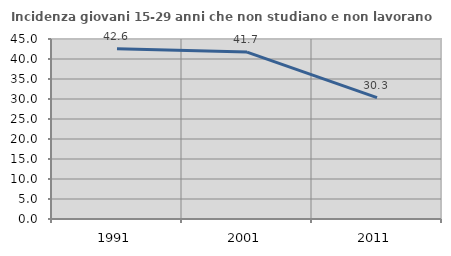
| Category | Incidenza giovani 15-29 anni che non studiano e non lavorano  |
|---|---|
| 1991.0 | 42.593 |
| 2001.0 | 41.739 |
| 2011.0 | 30.337 |